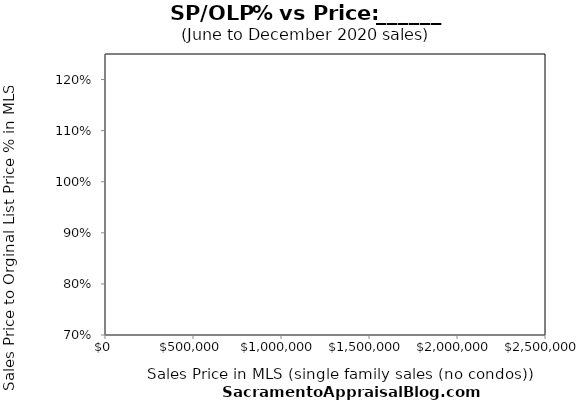
| Category | Sales Price |
|---|---|
|  | 0 |
|  | 0 |
|  | 0 |
|  | 0 |
|  | 0 |
|  | 0 |
|  | 0 |
|  | 0 |
|  | 0 |
|  | 0 |
|  | 0 |
|  | 0 |
|  | 0 |
|  | 0 |
|  | 0 |
|  | 0 |
|  | 0 |
|  | 0 |
|  | 0 |
|  | 0 |
|  | 0 |
|  | 0 |
|  | 0 |
|  | 0 |
|  | 0 |
|  | 0 |
|  | 0 |
|  | 0 |
|  | 0 |
|  | 0 |
|  | 0 |
|  | 0 |
|  | 0 |
|  | 0 |
|  | 0 |
|  | 0 |
|  | 0 |
|  | 0 |
|  | 0 |
|  | 0 |
|  | 0 |
|  | 0 |
|  | 0 |
|  | 0 |
|  | 0 |
|  | 0 |
|  | 0 |
|  | 0 |
|  | 0 |
|  | 0 |
|  | 0 |
|  | 0 |
|  | 0 |
|  | 0 |
|  | 0 |
|  | 0 |
|  | 0 |
|  | 0 |
|  | 0 |
|  | 0 |
|  | 0 |
|  | 0 |
|  | 0 |
|  | 0 |
|  | 0 |
|  | 0 |
|  | 0 |
|  | 0 |
|  | 0 |
|  | 0 |
|  | 0 |
|  | 0 |
|  | 0 |
|  | 0 |
|  | 0 |
|  | 0 |
|  | 0 |
|  | 0 |
|  | 0 |
|  | 0 |
|  | 0 |
|  | 0 |
|  | 0 |
|  | 0 |
|  | 0 |
|  | 0 |
|  | 0 |
|  | 0 |
|  | 0 |
|  | 0 |
|  | 0 |
|  | 0 |
|  | 0 |
|  | 0 |
|  | 0 |
|  | 0 |
|  | 0 |
|  | 0 |
|  | 0 |
|  | 0 |
|  | 0 |
|  | 0 |
|  | 0 |
|  | 0 |
|  | 0 |
|  | 0 |
|  | 0 |
|  | 0 |
|  | 0 |
|  | 0 |
|  | 0 |
|  | 0 |
|  | 0 |
|  | 0 |
|  | 0 |
|  | 0 |
|  | 0 |
|  | 0 |
|  | 0 |
|  | 0 |
|  | 0 |
|  | 0 |
|  | 0 |
|  | 0 |
|  | 0 |
|  | 0 |
|  | 0 |
|  | 0 |
|  | 0 |
|  | 0 |
|  | 0 |
|  | 0 |
|  | 0 |
|  | 0 |
|  | 0 |
|  | 0 |
|  | 0 |
|  | 0 |
|  | 0 |
|  | 0 |
|  | 0 |
|  | 0 |
|  | 0 |
|  | 0 |
|  | 0 |
|  | 0 |
|  | 0 |
|  | 0 |
|  | 0 |
|  | 0 |
|  | 0 |
|  | 0 |
|  | 0 |
|  | 0 |
|  | 0 |
|  | 0 |
|  | 0 |
|  | 0 |
|  | 0 |
|  | 0 |
|  | 0 |
|  | 0 |
|  | 0 |
|  | 0 |
|  | 0 |
|  | 0 |
|  | 0 |
|  | 0 |
|  | 0 |
|  | 0 |
|  | 0 |
|  | 0 |
|  | 0 |
|  | 0 |
|  | 0 |
|  | 0 |
|  | 0 |
|  | 0 |
|  | 0 |
|  | 0 |
|  | 0 |
|  | 0 |
|  | 0 |
|  | 0 |
|  | 0 |
|  | 0 |
|  | 0 |
|  | 0 |
|  | 0 |
|  | 0 |
|  | 0 |
|  | 0 |
|  | 0 |
|  | 0 |
|  | 0 |
|  | 0 |
|  | 0 |
|  | 0 |
|  | 0 |
|  | 0 |
|  | 0 |
|  | 0 |
|  | 0 |
|  | 0 |
|  | 0 |
|  | 0 |
|  | 0 |
|  | 0 |
|  | 0 |
|  | 0 |
|  | 0 |
|  | 0 |
|  | 0 |
|  | 0 |
|  | 0 |
|  | 0 |
|  | 0 |
|  | 0 |
|  | 0 |
|  | 0 |
|  | 0 |
|  | 0 |
|  | 0 |
|  | 0 |
|  | 0 |
|  | 0 |
|  | 0 |
|  | 0 |
|  | 0 |
|  | 0 |
|  | 0 |
|  | 0 |
|  | 0 |
|  | 0 |
|  | 0 |
|  | 0 |
|  | 0 |
|  | 0 |
|  | 0 |
|  | 0 |
|  | 0 |
|  | 0 |
|  | 0 |
|  | 0 |
|  | 0 |
|  | 0 |
|  | 0 |
|  | 0 |
|  | 0 |
|  | 0 |
|  | 0 |
|  | 0 |
|  | 0 |
|  | 0 |
|  | 0 |
|  | 0 |
|  | 0 |
|  | 0 |
|  | 0 |
|  | 0 |
|  | 0 |
|  | 0 |
|  | 0 |
|  | 0 |
|  | 0 |
|  | 0 |
|  | 0 |
|  | 0 |
|  | 0 |
|  | 0 |
|  | 0 |
|  | 0 |
|  | 0 |
|  | 0 |
|  | 0 |
|  | 0 |
|  | 0 |
|  | 0 |
|  | 0 |
|  | 0 |
|  | 0 |
|  | 0 |
|  | 0 |
|  | 0 |
|  | 0 |
|  | 0 |
|  | 0 |
|  | 0 |
|  | 0 |
|  | 0 |
|  | 0 |
|  | 0 |
|  | 0 |
|  | 0 |
|  | 0 |
|  | 0 |
|  | 0 |
|  | 0 |
|  | 0 |
|  | 0 |
|  | 0 |
|  | 0 |
|  | 0 |
|  | 0 |
|  | 0 |
|  | 0 |
|  | 0 |
|  | 0 |
|  | 0 |
|  | 0 |
|  | 0 |
|  | 0 |
|  | 0 |
|  | 0 |
|  | 0 |
|  | 0 |
|  | 0 |
|  | 0 |
|  | 0 |
|  | 0 |
|  | 0 |
|  | 0 |
|  | 0 |
|  | 0 |
|  | 0 |
|  | 0 |
|  | 0 |
|  | 0 |
|  | 0 |
|  | 0 |
|  | 0 |
|  | 0 |
|  | 0 |
|  | 0 |
|  | 0 |
|  | 0 |
|  | 0 |
|  | 0 |
|  | 0 |
|  | 0 |
|  | 0 |
|  | 0 |
|  | 0 |
|  | 0 |
|  | 0 |
|  | 0 |
|  | 0 |
|  | 0 |
|  | 0 |
|  | 0 |
|  | 0 |
|  | 0 |
|  | 0 |
|  | 0 |
|  | 0 |
|  | 0 |
|  | 0 |
|  | 0 |
|  | 0 |
|  | 0 |
|  | 0 |
|  | 0 |
|  | 0 |
|  | 0 |
|  | 0 |
|  | 0 |
|  | 0 |
|  | 0 |
|  | 0 |
|  | 0 |
|  | 0 |
|  | 0 |
|  | 0 |
|  | 0 |
|  | 0 |
|  | 0 |
|  | 0 |
|  | 0 |
|  | 0 |
|  | 0 |
|  | 0 |
|  | 0 |
|  | 0 |
|  | 0 |
|  | 0 |
|  | 0 |
|  | 0 |
|  | 0 |
|  | 0 |
|  | 0 |
|  | 0 |
|  | 0 |
|  | 0 |
|  | 0 |
|  | 0 |
|  | 0 |
|  | 0 |
|  | 0 |
|  | 0 |
|  | 0 |
|  | 0 |
|  | 0 |
|  | 0 |
|  | 0 |
|  | 0 |
|  | 0 |
|  | 0 |
|  | 0 |
|  | 0 |
|  | 0 |
|  | 0 |
|  | 0 |
|  | 0 |
|  | 0 |
|  | 0 |
|  | 0 |
|  | 0 |
|  | 0 |
|  | 0 |
|  | 0 |
|  | 0 |
|  | 0 |
|  | 0 |
|  | 0 |
|  | 0 |
|  | 0 |
|  | 0 |
|  | 0 |
|  | 0 |
|  | 0 |
|  | 0 |
|  | 0 |
|  | 0 |
|  | 0 |
|  | 0 |
|  | 0 |
|  | 0 |
|  | 0 |
|  | 0 |
|  | 0 |
|  | 0 |
|  | 0 |
|  | 0 |
|  | 0 |
|  | 0 |
|  | 0 |
|  | 0 |
|  | 0 |
|  | 0 |
|  | 0 |
|  | 0 |
|  | 0 |
|  | 0 |
|  | 0 |
|  | 0 |
|  | 0 |
|  | 0 |
|  | 0 |
|  | 0 |
|  | 0 |
|  | 0 |
|  | 0 |
|  | 0 |
|  | 0 |
|  | 0 |
|  | 0 |
|  | 0 |
|  | 0 |
|  | 0 |
|  | 0 |
|  | 0 |
|  | 0 |
|  | 0 |
|  | 0 |
|  | 0 |
|  | 0 |
|  | 0 |
|  | 0 |
|  | 0 |
|  | 0 |
|  | 0 |
|  | 0 |
|  | 0 |
|  | 0 |
|  | 0 |
|  | 0 |
|  | 0 |
|  | 0 |
|  | 0 |
|  | 0 |
|  | 0 |
|  | 0 |
|  | 0 |
|  | 0 |
|  | 0 |
|  | 0 |
|  | 0 |
|  | 0 |
|  | 0 |
|  | 0 |
|  | 0 |
|  | 0 |
|  | 0 |
|  | 0 |
|  | 0 |
|  | 0 |
|  | 0 |
|  | 0 |
|  | 0 |
|  | 0 |
|  | 0 |
|  | 0 |
|  | 0 |
|  | 0 |
|  | 0 |
|  | 0 |
|  | 0 |
|  | 0 |
|  | 0 |
|  | 0 |
|  | 0 |
|  | 0 |
|  | 0 |
|  | 0 |
|  | 0 |
|  | 0 |
|  | 0 |
|  | 0 |
|  | 0 |
|  | 0 |
|  | 0 |
|  | 0 |
|  | 0 |
|  | 0 |
|  | 0 |
|  | 0 |
|  | 0 |
|  | 0 |
|  | 0 |
|  | 0 |
|  | 0 |
|  | 0 |
|  | 0 |
|  | 0 |
|  | 0 |
|  | 0 |
|  | 0 |
|  | 0 |
|  | 0 |
|  | 0 |
|  | 0 |
|  | 0 |
|  | 0 |
|  | 0 |
|  | 0 |
|  | 0 |
|  | 0 |
|  | 0 |
|  | 0 |
|  | 0 |
|  | 0 |
|  | 0 |
|  | 0 |
|  | 0 |
|  | 0 |
|  | 0 |
|  | 0 |
|  | 0 |
|  | 0 |
|  | 0 |
|  | 0 |
|  | 0 |
|  | 0 |
|  | 0 |
|  | 0 |
|  | 0 |
|  | 0 |
|  | 0 |
|  | 0 |
|  | 0 |
|  | 0 |
|  | 0 |
|  | 0 |
|  | 0 |
|  | 0 |
|  | 0 |
|  | 0 |
|  | 0 |
|  | 0 |
|  | 0 |
|  | 0 |
|  | 0 |
|  | 0 |
|  | 0 |
|  | 0 |
|  | 0 |
|  | 0 |
|  | 0 |
|  | 0 |
|  | 0 |
|  | 0 |
|  | 0 |
|  | 0 |
|  | 0 |
|  | 0 |
|  | 0 |
|  | 0 |
|  | 0 |
|  | 0 |
|  | 0 |
|  | 0 |
|  | 0 |
|  | 0 |
|  | 0 |
|  | 0 |
|  | 0 |
|  | 0 |
|  | 0 |
|  | 0 |
|  | 0 |
|  | 0 |
|  | 0 |
|  | 0 |
|  | 0 |
|  | 0 |
|  | 0 |
|  | 0 |
|  | 0 |
|  | 0 |
|  | 0 |
|  | 0 |
|  | 0 |
|  | 0 |
|  | 0 |
|  | 0 |
|  | 0 |
|  | 0 |
|  | 0 |
|  | 0 |
|  | 0 |
|  | 0 |
|  | 0 |
|  | 0 |
|  | 0 |
|  | 0 |
|  | 0 |
|  | 0 |
|  | 0 |
|  | 0 |
|  | 0 |
|  | 0 |
|  | 0 |
|  | 0 |
|  | 0 |
|  | 0 |
|  | 0 |
|  | 0 |
|  | 0 |
|  | 0 |
|  | 0 |
|  | 0 |
|  | 0 |
|  | 0 |
|  | 0 |
|  | 0 |
|  | 0 |
|  | 0 |
|  | 0 |
|  | 0 |
|  | 0 |
|  | 0 |
|  | 0 |
|  | 0 |
|  | 0 |
|  | 0 |
|  | 0 |
|  | 0 |
|  | 0 |
|  | 0 |
|  | 0 |
|  | 0 |
|  | 0 |
|  | 0 |
|  | 0 |
|  | 0 |
|  | 0 |
|  | 0 |
|  | 0 |
|  | 0 |
|  | 0 |
|  | 0 |
|  | 0 |
|  | 0 |
|  | 0 |
|  | 0 |
|  | 0 |
|  | 0 |
|  | 0 |
|  | 0 |
|  | 0 |
|  | 0 |
|  | 0 |
|  | 0 |
|  | 0 |
|  | 0 |
|  | 0 |
|  | 0 |
|  | 0 |
|  | 0 |
|  | 0 |
|  | 0 |
|  | 0 |
|  | 0 |
|  | 0 |
|  | 0 |
|  | 0 |
|  | 0 |
|  | 0 |
|  | 0 |
|  | 0 |
|  | 0 |
|  | 0 |
|  | 0 |
|  | 0 |
|  | 0 |
|  | 0 |
|  | 0 |
|  | 0 |
|  | 0 |
|  | 0 |
|  | 0 |
|  | 0 |
|  | 0 |
|  | 0 |
|  | 0 |
|  | 0 |
|  | 0 |
|  | 0 |
|  | 0 |
|  | 0 |
|  | 0 |
|  | 0 |
|  | 0 |
|  | 0 |
|  | 0 |
|  | 0 |
|  | 0 |
|  | 0 |
|  | 0 |
|  | 0 |
|  | 0 |
|  | 0 |
|  | 0 |
|  | 0 |
|  | 0 |
|  | 0 |
|  | 0 |
|  | 0 |
|  | 0 |
|  | 0 |
|  | 0 |
|  | 0 |
|  | 0 |
|  | 0 |
|  | 0 |
|  | 0 |
|  | 0 |
|  | 0 |
|  | 0 |
|  | 0 |
|  | 0 |
|  | 0 |
|  | 0 |
|  | 0 |
|  | 0 |
|  | 0 |
|  | 0 |
|  | 0 |
|  | 0 |
|  | 0 |
|  | 0 |
|  | 0 |
|  | 0 |
|  | 0 |
|  | 0 |
|  | 0 |
|  | 0 |
|  | 0 |
|  | 0 |
|  | 0 |
|  | 0 |
|  | 0 |
|  | 0 |
|  | 0 |
|  | 0 |
|  | 0 |
|  | 0 |
|  | 0 |
|  | 0 |
|  | 0 |
|  | 0 |
|  | 0 |
|  | 0 |
|  | 0 |
|  | 0 |
|  | 0 |
|  | 0 |
|  | 0 |
|  | 0 |
|  | 0 |
|  | 0 |
|  | 0 |
|  | 0 |
|  | 0 |
|  | 0 |
|  | 0 |
|  | 0 |
|  | 0 |
|  | 0 |
|  | 0 |
|  | 0 |
|  | 0 |
|  | 0 |
|  | 0 |
|  | 0 |
|  | 0 |
|  | 0 |
|  | 0 |
|  | 0 |
|  | 0 |
|  | 0 |
|  | 0 |
|  | 0 |
|  | 0 |
|  | 0 |
|  | 0 |
|  | 0 |
|  | 0 |
|  | 0 |
|  | 0 |
|  | 0 |
|  | 0 |
|  | 0 |
|  | 0 |
|  | 0 |
|  | 0 |
|  | 0 |
|  | 0 |
|  | 0 |
|  | 0 |
|  | 0 |
|  | 0 |
|  | 0 |
|  | 0 |
|  | 0 |
|  | 0 |
|  | 0 |
|  | 0 |
|  | 0 |
|  | 0 |
|  | 0 |
|  | 0 |
|  | 0 |
|  | 0 |
|  | 0 |
|  | 0 |
|  | 0 |
|  | 0 |
|  | 0 |
|  | 0 |
|  | 0 |
|  | 0 |
|  | 0 |
|  | 0 |
|  | 0 |
|  | 0 |
|  | 0 |
|  | 0 |
|  | 0 |
|  | 0 |
|  | 0 |
|  | 0 |
|  | 0 |
|  | 0 |
|  | 0 |
|  | 0 |
|  | 0 |
|  | 0 |
|  | 0 |
|  | 0 |
|  | 0 |
|  | 0 |
|  | 0 |
|  | 0 |
|  | 0 |
|  | 0 |
|  | 0 |
|  | 0 |
|  | 0 |
|  | 0 |
|  | 0 |
|  | 0 |
|  | 0 |
|  | 0 |
|  | 0 |
|  | 0 |
|  | 0 |
|  | 0 |
|  | 0 |
|  | 0 |
|  | 0 |
|  | 0 |
|  | 0 |
|  | 0 |
|  | 0 |
|  | 0 |
|  | 0 |
|  | 0 |
|  | 0 |
|  | 0 |
|  | 0 |
|  | 0 |
|  | 0 |
|  | 0 |
|  | 0 |
|  | 0 |
|  | 0 |
|  | 0 |
|  | 0 |
|  | 0 |
|  | 0 |
|  | 0 |
|  | 0 |
|  | 0 |
|  | 0 |
|  | 0 |
|  | 0 |
|  | 0 |
|  | 0 |
|  | 0 |
|  | 0 |
|  | 0 |
|  | 0 |
|  | 0 |
|  | 0 |
|  | 0 |
|  | 0 |
|  | 0 |
|  | 0 |
|  | 0 |
|  | 0 |
|  | 0 |
|  | 0 |
|  | 0 |
|  | 0 |
|  | 0 |
|  | 0 |
|  | 0 |
|  | 0 |
|  | 0 |
|  | 0 |
|  | 0 |
|  | 0 |
|  | 0 |
|  | 0 |
|  | 0 |
|  | 0 |
|  | 0 |
|  | 0 |
|  | 0 |
|  | 0 |
|  | 0 |
|  | 0 |
|  | 0 |
|  | 0 |
|  | 0 |
|  | 0 |
|  | 0 |
|  | 0 |
|  | 0 |
|  | 0 |
|  | 0 |
|  | 0 |
|  | 0 |
|  | 0 |
|  | 0 |
|  | 0 |
|  | 0 |
|  | 0 |
|  | 0 |
|  | 0 |
|  | 0 |
|  | 0 |
|  | 0 |
|  | 0 |
|  | 0 |
|  | 0 |
|  | 0 |
|  | 0 |
|  | 0 |
|  | 0 |
|  | 0 |
|  | 0 |
|  | 0 |
|  | 0 |
|  | 0 |
|  | 0 |
|  | 0 |
|  | 0 |
|  | 0 |
|  | 0 |
|  | 0 |
|  | 0 |
|  | 0 |
|  | 0 |
|  | 0 |
|  | 0 |
|  | 0 |
|  | 0 |
|  | 0 |
|  | 0 |
|  | 0 |
|  | 0 |
|  | 0 |
|  | 0 |
|  | 0 |
|  | 0 |
|  | 0 |
|  | 0 |
|  | 0 |
|  | 0 |
|  | 0 |
|  | 0 |
|  | 0 |
|  | 0 |
|  | 0 |
|  | 0 |
|  | 0 |
|  | 0 |
|  | 0 |
|  | 0 |
|  | 0 |
|  | 0 |
|  | 0 |
|  | 0 |
|  | 0 |
|  | 0 |
|  | 0 |
|  | 0 |
|  | 0 |
|  | 0 |
|  | 0 |
|  | 0 |
|  | 0 |
|  | 0 |
|  | 0 |
|  | 0 |
|  | 0 |
|  | 0 |
|  | 0 |
|  | 0 |
|  | 0 |
|  | 0 |
|  | 0 |
|  | 0 |
|  | 0 |
|  | 0 |
|  | 0 |
|  | 0 |
|  | 0 |
|  | 0 |
|  | 0 |
|  | 0 |
|  | 0 |
|  | 0 |
|  | 0 |
|  | 0 |
|  | 0 |
|  | 0 |
|  | 0 |
|  | 0 |
|  | 0 |
|  | 0 |
|  | 0 |
|  | 0 |
|  | 0 |
|  | 0 |
|  | 0 |
|  | 0 |
|  | 0 |
|  | 0 |
|  | 0 |
|  | 0 |
|  | 0 |
|  | 0 |
|  | 0 |
|  | 0 |
|  | 0 |
|  | 0 |
|  | 0 |
|  | 0 |
|  | 0 |
|  | 0 |
|  | 0 |
|  | 0 |
|  | 0 |
|  | 0 |
|  | 0 |
|  | 0 |
|  | 0 |
|  | 0 |
|  | 0 |
|  | 0 |
|  | 0 |
|  | 0 |
|  | 0 |
|  | 0 |
|  | 0 |
|  | 0 |
|  | 0 |
|  | 0 |
|  | 0 |
|  | 0 |
|  | 0 |
|  | 0 |
|  | 0 |
|  | 0 |
|  | 0 |
|  | 0 |
|  | 0 |
|  | 0 |
|  | 0 |
|  | 0 |
|  | 0 |
|  | 0 |
|  | 0 |
|  | 0 |
|  | 0 |
|  | 0 |
|  | 0 |
|  | 0 |
|  | 0 |
|  | 0 |
|  | 0 |
|  | 0 |
|  | 0 |
|  | 0 |
|  | 0 |
|  | 0 |
|  | 0 |
|  | 0 |
|  | 0 |
|  | 0 |
|  | 0 |
|  | 0 |
|  | 0 |
|  | 0 |
|  | 0 |
|  | 0 |
|  | 0 |
|  | 0 |
|  | 0 |
|  | 0 |
|  | 0 |
|  | 0 |
|  | 0 |
|  | 0 |
|  | 0 |
|  | 0 |
|  | 0 |
|  | 0 |
|  | 0 |
|  | 0 |
|  | 0 |
|  | 0 |
|  | 0 |
|  | 0 |
|  | 0 |
|  | 0 |
|  | 0 |
|  | 0 |
|  | 0 |
|  | 0 |
|  | 0 |
|  | 0 |
|  | 0 |
|  | 0 |
|  | 0 |
|  | 0 |
|  | 0 |
|  | 0 |
|  | 0 |
|  | 0 |
|  | 0 |
|  | 0 |
|  | 0 |
|  | 0 |
|  | 0 |
|  | 0 |
|  | 0 |
|  | 0 |
|  | 0 |
|  | 0 |
|  | 0 |
|  | 0 |
|  | 0 |
|  | 0 |
|  | 0 |
|  | 0 |
|  | 0 |
|  | 0 |
|  | 0 |
|  | 0 |
|  | 0 |
|  | 0 |
|  | 0 |
|  | 0 |
|  | 0 |
|  | 0 |
|  | 0 |
|  | 0 |
|  | 0 |
|  | 0 |
|  | 0 |
|  | 0 |
|  | 0 |
|  | 0 |
|  | 0 |
|  | 0 |
|  | 0 |
|  | 0 |
|  | 0 |
|  | 0 |
|  | 0 |
|  | 0 |
|  | 0 |
|  | 0 |
|  | 0 |
|  | 0 |
|  | 0 |
|  | 0 |
|  | 0 |
|  | 0 |
|  | 0 |
|  | 0 |
|  | 0 |
|  | 0 |
|  | 0 |
|  | 0 |
|  | 0 |
|  | 0 |
|  | 0 |
|  | 0 |
|  | 0 |
|  | 0 |
|  | 0 |
|  | 0 |
|  | 0 |
|  | 0 |
|  | 0 |
|  | 0 |
|  | 0 |
|  | 0 |
|  | 0 |
|  | 0 |
|  | 0 |
|  | 0 |
|  | 0 |
|  | 0 |
|  | 0 |
|  | 0 |
|  | 0 |
|  | 0 |
|  | 0 |
|  | 0 |
|  | 0 |
|  | 0 |
|  | 0 |
|  | 0 |
|  | 0 |
|  | 0 |
|  | 0 |
|  | 0 |
|  | 0 |
|  | 0 |
|  | 0 |
|  | 0 |
|  | 0 |
|  | 0 |
|  | 0 |
|  | 0 |
|  | 0 |
|  | 0 |
|  | 0 |
|  | 0 |
|  | 0 |
|  | 0 |
|  | 0 |
|  | 0 |
|  | 0 |
|  | 0 |
|  | 0 |
|  | 0 |
|  | 0 |
|  | 0 |
|  | 0 |
|  | 0 |
|  | 0 |
|  | 0 |
|  | 0 |
|  | 0 |
|  | 0 |
|  | 0 |
|  | 0 |
|  | 0 |
|  | 0 |
|  | 0 |
|  | 0 |
|  | 0 |
|  | 0 |
|  | 0 |
|  | 0 |
|  | 0 |
|  | 0 |
|  | 0 |
|  | 0 |
|  | 0 |
|  | 0 |
|  | 0 |
|  | 0 |
|  | 0 |
|  | 0 |
|  | 0 |
|  | 0 |
|  | 0 |
|  | 0 |
|  | 0 |
|  | 0 |
|  | 0 |
|  | 0 |
|  | 0 |
|  | 0 |
|  | 0 |
|  | 0 |
|  | 0 |
|  | 0 |
|  | 0 |
|  | 0 |
|  | 0 |
|  | 0 |
|  | 0 |
|  | 0 |
|  | 0 |
|  | 0 |
|  | 0 |
|  | 0 |
|  | 0 |
|  | 0 |
|  | 0 |
|  | 0 |
|  | 0 |
|  | 0 |
|  | 0 |
|  | 0 |
|  | 0 |
|  | 0 |
|  | 0 |
|  | 0 |
|  | 0 |
|  | 0 |
|  | 0 |
|  | 0 |
|  | 0 |
|  | 0 |
|  | 0 |
|  | 0 |
|  | 0 |
|  | 0 |
|  | 0 |
|  | 0 |
|  | 0 |
|  | 0 |
|  | 0 |
|  | 0 |
|  | 0 |
|  | 0 |
|  | 0 |
|  | 0 |
|  | 0 |
|  | 0 |
|  | 0 |
|  | 0 |
|  | 0 |
|  | 0 |
|  | 0 |
|  | 0 |
|  | 0 |
|  | 0 |
|  | 0 |
|  | 0 |
|  | 0 |
|  | 0 |
|  | 0 |
|  | 0 |
|  | 0 |
|  | 0 |
|  | 0 |
|  | 0 |
|  | 0 |
|  | 0 |
|  | 0 |
|  | 0 |
|  | 0 |
|  | 0 |
|  | 0 |
|  | 0 |
|  | 0 |
|  | 0 |
|  | 0 |
|  | 0 |
|  | 0 |
|  | 0 |
|  | 0 |
|  | 0 |
|  | 0 |
|  | 0 |
|  | 0 |
|  | 0 |
|  | 0 |
|  | 0 |
|  | 0 |
|  | 0 |
|  | 0 |
|  | 0 |
|  | 0 |
|  | 0 |
|  | 0 |
|  | 0 |
|  | 0 |
|  | 0 |
|  | 0 |
|  | 0 |
|  | 0 |
|  | 0 |
|  | 0 |
|  | 0 |
|  | 0 |
|  | 0 |
|  | 0 |
|  | 0 |
|  | 0 |
|  | 0 |
|  | 0 |
|  | 0 |
|  | 0 |
|  | 0 |
|  | 0 |
|  | 0 |
|  | 0 |
|  | 0 |
|  | 0 |
|  | 0 |
|  | 0 |
|  | 0 |
|  | 0 |
|  | 0 |
|  | 0 |
|  | 0 |
|  | 0 |
|  | 0 |
|  | 0 |
|  | 0 |
|  | 0 |
|  | 0 |
|  | 0 |
|  | 0 |
|  | 0 |
|  | 0 |
|  | 0 |
|  | 0 |
|  | 0 |
|  | 0 |
|  | 0 |
|  | 0 |
|  | 0 |
|  | 0 |
|  | 0 |
|  | 0 |
|  | 0 |
|  | 0 |
|  | 0 |
|  | 0 |
|  | 0 |
|  | 0 |
|  | 0 |
|  | 0 |
|  | 0 |
|  | 0 |
|  | 0 |
|  | 0 |
|  | 0 |
|  | 0 |
|  | 0 |
|  | 0 |
|  | 0 |
|  | 0 |
|  | 0 |
|  | 0 |
|  | 0 |
|  | 0 |
|  | 0 |
|  | 0 |
|  | 0 |
|  | 0 |
|  | 0 |
|  | 0 |
|  | 0 |
|  | 0 |
|  | 0 |
|  | 0 |
|  | 0 |
|  | 0 |
|  | 0 |
|  | 0 |
|  | 0 |
|  | 0 |
|  | 0 |
|  | 0 |
|  | 0 |
|  | 0 |
|  | 0 |
|  | 0 |
|  | 0 |
|  | 0 |
|  | 0 |
|  | 0 |
|  | 0 |
|  | 0 |
|  | 0 |
|  | 0 |
|  | 0 |
|  | 0 |
|  | 0 |
|  | 0 |
|  | 0 |
|  | 0 |
|  | 0 |
|  | 0 |
|  | 0 |
|  | 0 |
|  | 0 |
|  | 0 |
|  | 0 |
|  | 0 |
|  | 0 |
|  | 0 |
|  | 0 |
|  | 0 |
|  | 0 |
|  | 0 |
|  | 0 |
|  | 0 |
|  | 0 |
|  | 0 |
|  | 0 |
|  | 0 |
|  | 0 |
|  | 0 |
|  | 0 |
|  | 0 |
|  | 0 |
|  | 0 |
|  | 0 |
|  | 0 |
|  | 0 |
|  | 0 |
|  | 0 |
|  | 0 |
|  | 0 |
|  | 0 |
|  | 0 |
|  | 0 |
|  | 0 |
|  | 0 |
|  | 0 |
|  | 0 |
|  | 0 |
|  | 0 |
|  | 0 |
|  | 0 |
|  | 0 |
|  | 0 |
|  | 0 |
|  | 0 |
|  | 0 |
|  | 0 |
|  | 0 |
|  | 0 |
|  | 0 |
|  | 0 |
|  | 0 |
|  | 0 |
|  | 0 |
|  | 0 |
|  | 0 |
|  | 0 |
|  | 0 |
|  | 0 |
|  | 0 |
|  | 0 |
|  | 0 |
|  | 0 |
|  | 0 |
|  | 0 |
|  | 0 |
|  | 0 |
|  | 0 |
|  | 0 |
|  | 0 |
|  | 0 |
|  | 0 |
|  | 0 |
|  | 0 |
|  | 0 |
|  | 0 |
|  | 0 |
|  | 0 |
|  | 0 |
|  | 0 |
|  | 0 |
|  | 0 |
|  | 0 |
|  | 0 |
|  | 0 |
|  | 0 |
|  | 0 |
|  | 0 |
|  | 0 |
|  | 0 |
|  | 0 |
|  | 0 |
|  | 0 |
|  | 0 |
|  | 0 |
|  | 0 |
|  | 0 |
|  | 0 |
|  | 0 |
|  | 0 |
|  | 0 |
|  | 0 |
|  | 0 |
|  | 0 |
|  | 0 |
|  | 0 |
|  | 0 |
|  | 0 |
|  | 0 |
|  | 0 |
|  | 0 |
|  | 0 |
|  | 0 |
|  | 0 |
|  | 0 |
|  | 0 |
|  | 0 |
|  | 0 |
|  | 0 |
|  | 0 |
|  | 0 |
|  | 0 |
|  | 0 |
|  | 0 |
|  | 0 |
|  | 0 |
|  | 0 |
|  | 0 |
|  | 0 |
|  | 0 |
|  | 0 |
|  | 0 |
|  | 0 |
|  | 0 |
|  | 0 |
|  | 0 |
|  | 0 |
|  | 0 |
|  | 0 |
|  | 0 |
|  | 0 |
|  | 0 |
|  | 0 |
|  | 0 |
|  | 0 |
|  | 0 |
|  | 0 |
|  | 0 |
|  | 0 |
|  | 0 |
|  | 0 |
|  | 0 |
|  | 0 |
|  | 0 |
|  | 0 |
|  | 0 |
|  | 0 |
|  | 0 |
|  | 0 |
|  | 0 |
|  | 0 |
|  | 0 |
|  | 0 |
|  | 0 |
|  | 0 |
|  | 0 |
|  | 0 |
|  | 0 |
|  | 0 |
|  | 0 |
|  | 0 |
|  | 0 |
|  | 0 |
|  | 0 |
|  | 0 |
|  | 0 |
|  | 0 |
|  | 0 |
|  | 0 |
|  | 0 |
|  | 0 |
|  | 0 |
|  | 0 |
|  | 0 |
|  | 0 |
|  | 0 |
|  | 0 |
|  | 0 |
|  | 0 |
|  | 0 |
|  | 0 |
|  | 0 |
|  | 0 |
|  | 0 |
|  | 0 |
|  | 0 |
|  | 0 |
|  | 0 |
|  | 0 |
|  | 0 |
|  | 0 |
|  | 0 |
|  | 0 |
|  | 0 |
|  | 0 |
|  | 0 |
|  | 0 |
|  | 0 |
|  | 0 |
|  | 0 |
|  | 0 |
|  | 0 |
|  | 0 |
|  | 0 |
|  | 0 |
|  | 0 |
|  | 0 |
|  | 0 |
|  | 0 |
|  | 0 |
|  | 0 |
|  | 0 |
|  | 0 |
|  | 0 |
|  | 0 |
|  | 0 |
|  | 0 |
|  | 0 |
|  | 0 |
|  | 0 |
|  | 0 |
|  | 0 |
|  | 0 |
|  | 0 |
|  | 0 |
|  | 0 |
|  | 0 |
|  | 0 |
|  | 0 |
|  | 0 |
|  | 0 |
|  | 0 |
|  | 0 |
|  | 0 |
|  | 0 |
|  | 0 |
|  | 0 |
|  | 0 |
|  | 0 |
|  | 0 |
|  | 0 |
|  | 0 |
|  | 0 |
|  | 0 |
|  | 0 |
|  | 0 |
|  | 0 |
|  | 0 |
|  | 0 |
|  | 0 |
|  | 0 |
|  | 0 |
|  | 0 |
|  | 0 |
|  | 0 |
|  | 0 |
|  | 0 |
|  | 0 |
|  | 0 |
|  | 0 |
|  | 0 |
|  | 0 |
|  | 0 |
|  | 0 |
|  | 0 |
|  | 0 |
|  | 0 |
|  | 0 |
|  | 0 |
|  | 0 |
|  | 0 |
|  | 0 |
|  | 0 |
|  | 0 |
|  | 0 |
|  | 0 |
|  | 0 |
|  | 0 |
|  | 0 |
|  | 0 |
|  | 0 |
|  | 0 |
|  | 0 |
|  | 0 |
|  | 0 |
|  | 0 |
|  | 0 |
|  | 0 |
|  | 0 |
|  | 0 |
|  | 0 |
|  | 0 |
|  | 0 |
|  | 0 |
|  | 0 |
|  | 0 |
|  | 0 |
|  | 0 |
|  | 0 |
|  | 0 |
|  | 0 |
|  | 0 |
|  | 0 |
|  | 0 |
|  | 0 |
|  | 0 |
|  | 0 |
|  | 0 |
|  | 0 |
|  | 0 |
|  | 0 |
|  | 0 |
|  | 0 |
|  | 0 |
|  | 0 |
|  | 0 |
|  | 0 |
|  | 0 |
|  | 0 |
|  | 0 |
|  | 0 |
|  | 0 |
|  | 0 |
|  | 0 |
|  | 0 |
|  | 0 |
|  | 0 |
|  | 0 |
|  | 0 |
|  | 0 |
|  | 0 |
|  | 0 |
|  | 0 |
|  | 0 |
|  | 0 |
|  | 0 |
|  | 0 |
|  | 0 |
|  | 0 |
|  | 0 |
|  | 0 |
|  | 0 |
|  | 0 |
|  | 0 |
|  | 0 |
|  | 0 |
|  | 0 |
|  | 0 |
|  | 0 |
|  | 0 |
|  | 0 |
|  | 0 |
|  | 0 |
|  | 0 |
|  | 0 |
|  | 0 |
|  | 0 |
|  | 0 |
|  | 0 |
|  | 0 |
|  | 0 |
|  | 0 |
|  | 0 |
|  | 0 |
|  | 0 |
|  | 0 |
|  | 0 |
|  | 0 |
|  | 0 |
|  | 0 |
|  | 0 |
|  | 0 |
|  | 0 |
|  | 0 |
|  | 0 |
|  | 0 |
|  | 0 |
|  | 0 |
|  | 0 |
|  | 0 |
|  | 0 |
|  | 0 |
|  | 0 |
|  | 0 |
|  | 0 |
|  | 0 |
|  | 0 |
|  | 0 |
|  | 0 |
|  | 0 |
|  | 0 |
|  | 0 |
|  | 0 |
|  | 0 |
|  | 0 |
|  | 0 |
|  | 0 |
|  | 0 |
|  | 0 |
|  | 0 |
|  | 0 |
|  | 0 |
|  | 0 |
|  | 0 |
|  | 0 |
|  | 0 |
|  | 0 |
|  | 0 |
|  | 0 |
|  | 0 |
|  | 0 |
|  | 0 |
|  | 0 |
|  | 0 |
|  | 0 |
|  | 0 |
|  | 0 |
|  | 0 |
|  | 0 |
|  | 0 |
|  | 0 |
|  | 0 |
|  | 0 |
|  | 0 |
|  | 0 |
|  | 0 |
|  | 0 |
|  | 0 |
|  | 0 |
|  | 0 |
|  | 0 |
|  | 0 |
|  | 0 |
|  | 0 |
|  | 0 |
|  | 0 |
|  | 0 |
|  | 0 |
|  | 0 |
|  | 0 |
|  | 0 |
|  | 0 |
|  | 0 |
|  | 0 |
|  | 0 |
|  | 0 |
|  | 0 |
|  | 0 |
|  | 0 |
|  | 0 |
|  | 0 |
|  | 0 |
|  | 0 |
|  | 0 |
|  | 0 |
|  | 0 |
|  | 0 |
|  | 0 |
|  | 0 |
|  | 0 |
|  | 0 |
|  | 0 |
|  | 0 |
|  | 0 |
|  | 0 |
|  | 0 |
|  | 0 |
|  | 0 |
|  | 0 |
|  | 0 |
|  | 0 |
|  | 0 |
|  | 0 |
|  | 0 |
|  | 0 |
|  | 0 |
|  | 0 |
|  | 0 |
|  | 0 |
|  | 0 |
|  | 0 |
|  | 0 |
|  | 0 |
|  | 0 |
|  | 0 |
|  | 0 |
|  | 0 |
|  | 0 |
|  | 0 |
|  | 0 |
|  | 0 |
|  | 0 |
|  | 0 |
|  | 0 |
|  | 0 |
|  | 0 |
|  | 0 |
|  | 0 |
|  | 0 |
|  | 0 |
|  | 0 |
|  | 0 |
|  | 0 |
|  | 0 |
|  | 0 |
|  | 0 |
|  | 0 |
|  | 0 |
|  | 0 |
|  | 0 |
|  | 0 |
|  | 0 |
|  | 0 |
|  | 0 |
|  | 0 |
|  | 0 |
|  | 0 |
|  | 0 |
|  | 0 |
|  | 0 |
|  | 0 |
|  | 0 |
|  | 0 |
|  | 0 |
|  | 0 |
|  | 0 |
|  | 0 |
|  | 0 |
|  | 0 |
|  | 0 |
|  | 0 |
|  | 0 |
|  | 0 |
|  | 0 |
|  | 0 |
|  | 0 |
|  | 0 |
|  | 0 |
|  | 0 |
|  | 0 |
|  | 0 |
|  | 0 |
|  | 0 |
|  | 0 |
|  | 0 |
|  | 0 |
|  | 0 |
|  | 0 |
|  | 0 |
|  | 0 |
|  | 0 |
|  | 0 |
|  | 0 |
|  | 0 |
|  | 0 |
|  | 0 |
|  | 0 |
|  | 0 |
|  | 0 |
|  | 0 |
|  | 0 |
|  | 0 |
|  | 0 |
|  | 0 |
|  | 0 |
|  | 0 |
|  | 0 |
|  | 0 |
|  | 0 |
|  | 0 |
|  | 0 |
|  | 0 |
|  | 0 |
|  | 0 |
|  | 0 |
|  | 0 |
|  | 0 |
|  | 0 |
|  | 0 |
|  | 0 |
|  | 0 |
|  | 0 |
|  | 0 |
|  | 0 |
|  | 0 |
|  | 0 |
|  | 0 |
|  | 0 |
|  | 0 |
|  | 0 |
|  | 0 |
|  | 0 |
|  | 0 |
|  | 0 |
|  | 0 |
|  | 0 |
|  | 0 |
|  | 0 |
|  | 0 |
|  | 0 |
|  | 0 |
|  | 0 |
|  | 0 |
|  | 0 |
|  | 0 |
|  | 0 |
|  | 0 |
|  | 0 |
|  | 0 |
|  | 0 |
|  | 0 |
|  | 0 |
|  | 0 |
|  | 0 |
|  | 0 |
|  | 0 |
|  | 0 |
|  | 0 |
|  | 0 |
|  | 0 |
|  | 0 |
|  | 0 |
|  | 0 |
|  | 0 |
|  | 0 |
|  | 0 |
|  | 0 |
|  | 0 |
|  | 0 |
|  | 0 |
|  | 0 |
|  | 0 |
|  | 0 |
|  | 0 |
|  | 0 |
|  | 0 |
|  | 0 |
|  | 0 |
|  | 0 |
|  | 0 |
|  | 0 |
|  | 0 |
|  | 0 |
|  | 0 |
|  | 0 |
|  | 0 |
|  | 0 |
|  | 0 |
|  | 0 |
|  | 0 |
|  | 0 |
|  | 0 |
|  | 0 |
|  | 0 |
|  | 0 |
|  | 0 |
|  | 0 |
|  | 0 |
|  | 0 |
|  | 0 |
|  | 0 |
|  | 0 |
|  | 0 |
|  | 0 |
|  | 0 |
|  | 0 |
|  | 0 |
|  | 0 |
|  | 0 |
|  | 0 |
|  | 0 |
|  | 0 |
|  | 0 |
|  | 0 |
|  | 0 |
|  | 0 |
|  | 0 |
|  | 0 |
|  | 0 |
|  | 0 |
|  | 0 |
|  | 0 |
|  | 0 |
|  | 0 |
|  | 0 |
|  | 0 |
|  | 0 |
|  | 0 |
|  | 0 |
|  | 0 |
|  | 0 |
|  | 0 |
|  | 0 |
|  | 0 |
|  | 0 |
|  | 0 |
|  | 0 |
|  | 0 |
|  | 0 |
|  | 0 |
|  | 0 |
|  | 0 |
|  | 0 |
|  | 0 |
|  | 0 |
|  | 0 |
|  | 0 |
|  | 0 |
|  | 0 |
|  | 0 |
|  | 0 |
|  | 0 |
|  | 0 |
|  | 0 |
|  | 0 |
|  | 0 |
|  | 0 |
|  | 0 |
|  | 0 |
|  | 0 |
|  | 0 |
|  | 0 |
|  | 0 |
|  | 0 |
|  | 0 |
|  | 0 |
|  | 0 |
|  | 0 |
|  | 0 |
|  | 0 |
|  | 0 |
|  | 0 |
|  | 0 |
|  | 0 |
|  | 0 |
|  | 0 |
|  | 0 |
|  | 0 |
|  | 0 |
|  | 0 |
|  | 0 |
|  | 0 |
|  | 0 |
|  | 0 |
|  | 0 |
|  | 0 |
|  | 0 |
|  | 0 |
|  | 0 |
|  | 0 |
|  | 0 |
|  | 0 |
|  | 0 |
|  | 0 |
|  | 0 |
|  | 0 |
|  | 0 |
|  | 0 |
|  | 0 |
|  | 0 |
|  | 0 |
|  | 0 |
|  | 0 |
|  | 0 |
|  | 0 |
|  | 0 |
|  | 0 |
|  | 0 |
|  | 0 |
|  | 0 |
|  | 0 |
|  | 0 |
|  | 0 |
|  | 0 |
|  | 0 |
|  | 0 |
|  | 0 |
|  | 0 |
|  | 0 |
|  | 0 |
|  | 0 |
|  | 0 |
|  | 0 |
|  | 0 |
|  | 0 |
|  | 0 |
|  | 0 |
|  | 0 |
|  | 0 |
|  | 0 |
|  | 0 |
|  | 0 |
|  | 0 |
|  | 0 |
|  | 0 |
|  | 0 |
|  | 0 |
|  | 0 |
|  | 0 |
|  | 0 |
|  | 0 |
|  | 0 |
|  | 0 |
|  | 0 |
|  | 0 |
|  | 0 |
|  | 0 |
|  | 0 |
|  | 0 |
|  | 0 |
|  | 0 |
|  | 0 |
|  | 0 |
|  | 0 |
|  | 0 |
|  | 0 |
|  | 0 |
|  | 0 |
|  | 0 |
|  | 0 |
|  | 0 |
|  | 0 |
|  | 0 |
|  | 0 |
|  | 0 |
|  | 0 |
|  | 0 |
|  | 0 |
|  | 0 |
|  | 0 |
|  | 0 |
|  | 0 |
|  | 0 |
|  | 0 |
|  | 0 |
|  | 0 |
|  | 0 |
|  | 0 |
|  | 0 |
|  | 0 |
|  | 0 |
|  | 0 |
|  | 0 |
|  | 0 |
|  | 0 |
|  | 0 |
|  | 0 |
|  | 0 |
|  | 0 |
|  | 0 |
|  | 0 |
|  | 0 |
|  | 0 |
|  | 0 |
|  | 0 |
|  | 0 |
|  | 0 |
|  | 0 |
|  | 0 |
|  | 0 |
|  | 0 |
|  | 0 |
|  | 0 |
|  | 0 |
|  | 0 |
|  | 0 |
|  | 0 |
|  | 0 |
|  | 0 |
|  | 0 |
|  | 0 |
|  | 0 |
|  | 0 |
|  | 0 |
|  | 0 |
|  | 0 |
|  | 0 |
|  | 0 |
|  | 0 |
|  | 0 |
|  | 0 |
|  | 0 |
|  | 0 |
|  | 0 |
|  | 0 |
|  | 0 |
|  | 0 |
|  | 0 |
|  | 0 |
|  | 0 |
|  | 0 |
|  | 0 |
|  | 0 |
|  | 0 |
|  | 0 |
|  | 0 |
|  | 0 |
|  | 0 |
|  | 0 |
|  | 0 |
|  | 0 |
|  | 0 |
|  | 0 |
|  | 0 |
|  | 0 |
|  | 0 |
|  | 0 |
|  | 0 |
|  | 0 |
|  | 0 |
|  | 0 |
|  | 0 |
|  | 0 |
|  | 0 |
|  | 0 |
|  | 0 |
|  | 0 |
|  | 0 |
|  | 0 |
|  | 0 |
|  | 0 |
|  | 0 |
|  | 0 |
|  | 0 |
|  | 0 |
|  | 0 |
|  | 0 |
|  | 0 |
|  | 0 |
|  | 0 |
|  | 0 |
|  | 0 |
|  | 0 |
|  | 0 |
|  | 0 |
|  | 0 |
|  | 0 |
|  | 0 |
|  | 0 |
|  | 0 |